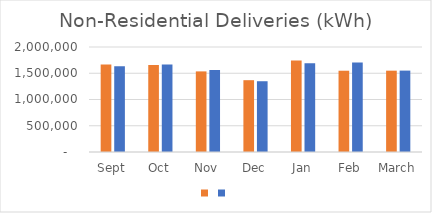
| Category | Series 1 | Series 0 |
|---|---|---|
| Sept | 1665239 | 1633351 |
| Oct | 1657467 | 1665276 |
| Nov | 1535448 | 1561812 |
| Dec | 1367905 | 1348000 |
| Jan | 1741151 | 1691318 |
| Feb | 1548063 | 1705422 |
| March | 1549153 | 1550355 |